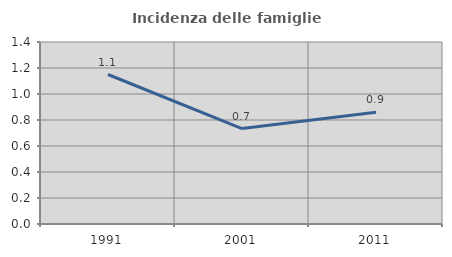
| Category | Incidenza delle famiglie numerose |
|---|---|
| 1991.0 | 1.15 |
| 2001.0 | 0.734 |
| 2011.0 | 0.859 |